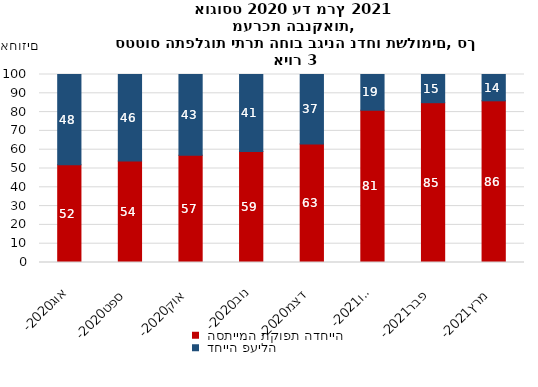
| Category |  הסתיימה תקופת הדחייה  |  דחייה פעילה  |
|---|---|---|
| אוג-2020 | 52 | 48 |
| ספט-2020 | 54 | 46 |
| אוק-2020 | 57 | 43 |
| נוב-2020 | 59 | 41 |
| דצמ-2020 | 63 | 37 |
| ינו-2021 | 81 | 19 |
| פבר-2021 | 85 | 15 |
| מרץ-2021 | 86 | 14 |